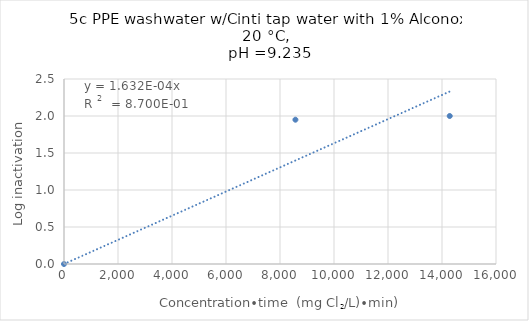
| Category | Series 0 |
|---|---|
| 0.0 | 0 |
| 8571.428571428572 | 1.95 |
| 14285.714285714286 | 2 |